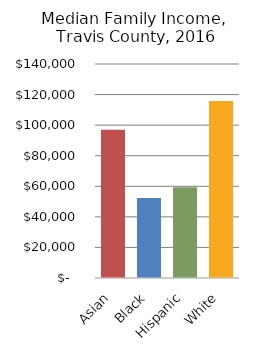
| Category | Series 0 |
|---|---|
| Asian | 96925 |
| Black | 52406 |
| Hispanic | 59341 |
| White | 115769 |